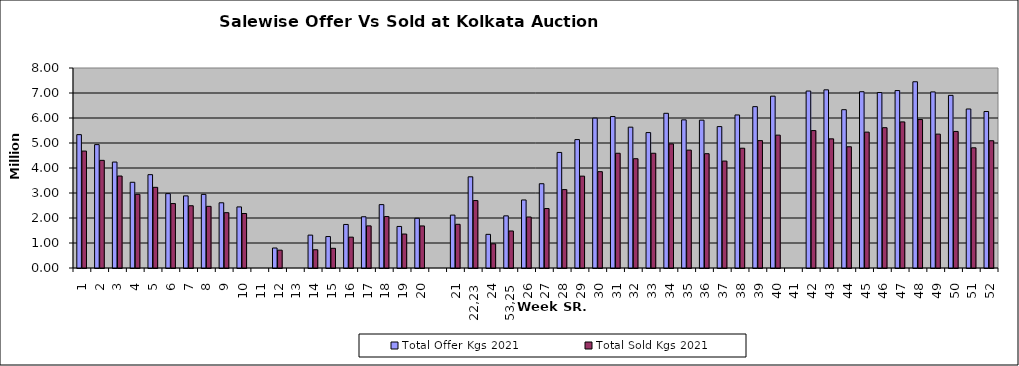
| Category | Total Offer Kgs 2021 | Total Sold Kgs 2021 |
|---|---|---|
| 1 | 5334238.45 | 4676950.6 |
| 2 | 4935200.7 | 4305668.9 |
| 3 | 4237712.3 | 3678975 |
| 4 | 3429367.8 | 2946616 |
| 5 | 3733148.07 | 3226331.47 |
| 6 | 2974642.18 | 2577147.38 |
| 7 | 2883983.7 | 2490358.3 |
| 8 | 2944665.5 | 2465974 |
| 9 | 2608289.9 | 2213029 |
| 10 | 2443262.55 | 2179535.45 |
| 11 | 0 | 0 |
| 12 | 799589.8 | 713472.5 |
| 13 | 0 | 0 |
| 14 | 1315500.61 | 729386.75 |
| 15 | 1257922.54 | 788099.6 |
| 16 | 1741788.35 | 1233812.25 |
| 17 | 2049148.35 | 1684566.9 |
| 18 | 2535024.93 | 2058375.53 |
| 19 | 1661942.9 | 1358608.15 |
| 20 | 1988920.95 | 1682271.05 |
|  | 0 | 0 |
| 21 | 2115742.55 | 1748007.6 |
| 22,23 | 3647443.02 | 2697538.35 |
| 24 | 1345841.2 | 967197.9 |
| 53,25 | 2085913.65 | 1480939.25 |
| 26 | 2721581.65 | 2040491.35 |
| 27 | 3370854.72 | 2378950.22 |
| 28 | 4622004.31 | 3136181.96 |
| 29 | 5135988.75 | 3674086 |
| 30 | 5995620.65 | 3852647.35 |
| 31 | 6058448.75 | 4589592.4 |
| 32 | 5633154.05 | 4371667.1 |
| 33 | 5416461.4 | 4589613.5 |
| 34 | 6188048.53 | 4963155.85 |
| 35 | 5925126.58 | 4715522.73 |
| 36 | 5914059.35 | 4572273.85 |
| 37 | 5655912.76 | 4277490.1 |
| 38 | 6121306.16 | 4791005.76 |
| 39 | 6454214.7 | 5095133.4 |
| 40 | 6872890.1 | 5314846.6 |
| 41 | 0 | 0 |
| 42 | 7078260.51 | 5496541.7 |
| 43 | 7126791.78 | 5165650.18 |
| 44 | 6332300.41 | 4849367.21 |
| 45 | 7051238.6 | 5434649.4 |
| 46 | 7018555.76 | 5613021.35 |
| 47 | 7097698.76 | 5844235.36 |
| 48 | 7449972.02 | 5937578.35 |
| 49 | 7043459.8 | 5354968.8 |
| 50 | 6905902.41 | 5462767.81 |
| 51 | 6360009.9 | 4807889.7 |
| 52 | 6260070.21 | 5090328.91 |